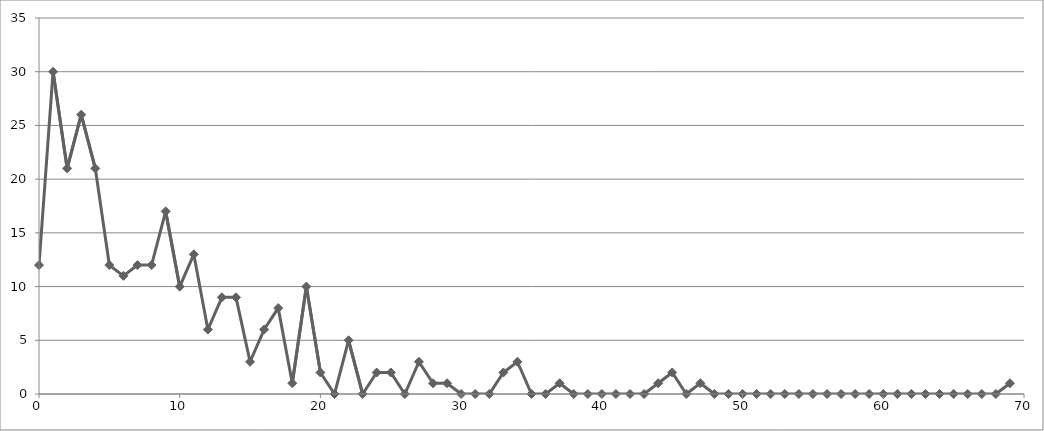
| Category | Series 0 |
|---|---|
| 0.0 | 12 |
| 1.0 | 30 |
| 2.0 | 21 |
| 3.0 | 26 |
| 4.0 | 21 |
| 5.0 | 12 |
| 6.0 | 11 |
| 7.0 | 12 |
| 8.0 | 12 |
| 9.0 | 17 |
| 10.0 | 10 |
| 11.0 | 13 |
| 12.0 | 6 |
| 13.0 | 9 |
| 14.0 | 9 |
| 15.0 | 3 |
| 16.0 | 6 |
| 17.0 | 8 |
| 18.0 | 1 |
| 19.0 | 10 |
| 20.0 | 2 |
| 21.0 | 0 |
| 22.0 | 5 |
| 23.0 | 0 |
| 24.0 | 2 |
| 25.0 | 2 |
| 26.0 | 0 |
| 27.0 | 3 |
| 28.0 | 1 |
| 29.0 | 1 |
| 30.0 | 0 |
| 31.0 | 0 |
| 32.0 | 0 |
| 33.0 | 2 |
| 34.0 | 3 |
| 35.0 | 0 |
| 36.0 | 0 |
| 37.0 | 1 |
| 38.0 | 0 |
| 39.0 | 0 |
| 40.0 | 0 |
| 41.0 | 0 |
| 42.0 | 0 |
| 43.0 | 0 |
| 44.0 | 1 |
| 45.0 | 2 |
| 46.0 | 0 |
| 47.0 | 1 |
| 48.0 | 0 |
| 49.0 | 0 |
| 50.0 | 0 |
| 51.0 | 0 |
| 52.0 | 0 |
| 53.0 | 0 |
| 54.0 | 0 |
| 55.0 | 0 |
| 56.0 | 0 |
| 57.0 | 0 |
| 58.0 | 0 |
| 59.0 | 0 |
| 60.0 | 0 |
| 61.0 | 0 |
| 62.0 | 0 |
| 63.0 | 0 |
| 64.0 | 0 |
| 65.0 | 0 |
| 66.0 | 0 |
| 67.0 | 0 |
| 68.0 | 0 |
| 69.0 | 1 |